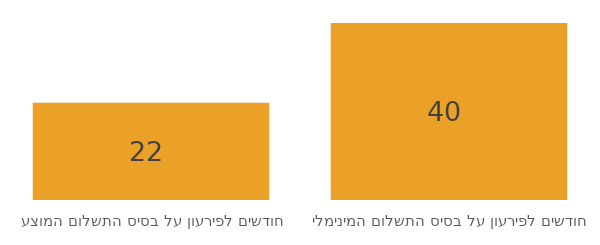
| Category | Series 0 |
|---|---|
| חודשים לפירעון על בסיס התשלום המינימלי | 40 |
| חודשים לפירעון על בסיס התשלום המוצע | 22 |